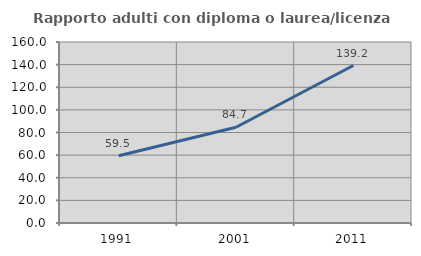
| Category | Rapporto adulti con diploma o laurea/licenza media  |
|---|---|
| 1991.0 | 59.501 |
| 2001.0 | 84.66 |
| 2011.0 | 139.209 |